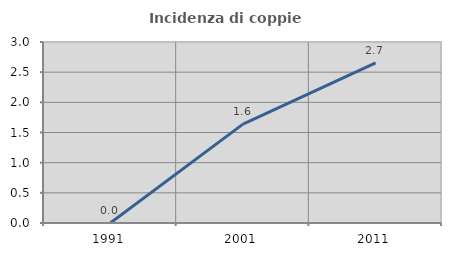
| Category | Incidenza di coppie miste |
|---|---|
| 1991.0 | 0 |
| 2001.0 | 1.639 |
| 2011.0 | 2.655 |